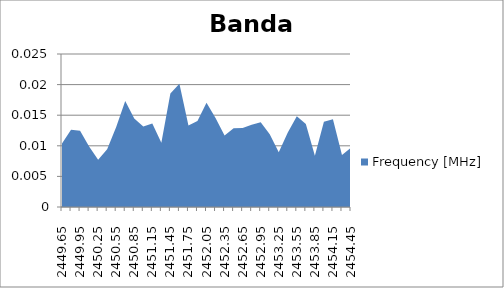
| Category | Frequency [MHz] |
|---|---|
| 2449.65 | 0.01 |
| 2449.8 | 0.013 |
| 2449.95 | 0.012 |
| 2450.1 | 0.01 |
| 2450.25 | 0.008 |
| 2450.4 | 0.009 |
| 2450.55 | 0.013 |
| 2450.7 | 0.017 |
| 2450.85 | 0.014 |
| 2451.0 | 0.013 |
| 2451.15 | 0.014 |
| 2451.3 | 0.011 |
| 2451.45 | 0.019 |
| 2451.6 | 0.02 |
| 2451.75 | 0.013 |
| 2451.9 | 0.014 |
| 2452.05 | 0.017 |
| 2452.2 | 0.015 |
| 2452.35 | 0.012 |
| 2452.5 | 0.013 |
| 2452.65 | 0.013 |
| 2452.8 | 0.013 |
| 2452.95 | 0.014 |
| 2453.1 | 0.012 |
| 2453.25 | 0.009 |
| 2453.4 | 0.012 |
| 2453.55 | 0.015 |
| 2453.7 | 0.014 |
| 2453.85 | 0.008 |
| 2454.0 | 0.014 |
| 2454.15 | 0.014 |
| 2454.3 | 0.008 |
| 2454.45 | 0.01 |